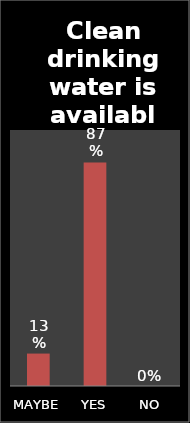
| Category | Series 0 |
|---|---|
| MAYBE | 0.127 |
| YES | 0.873 |
| NO | 0 |